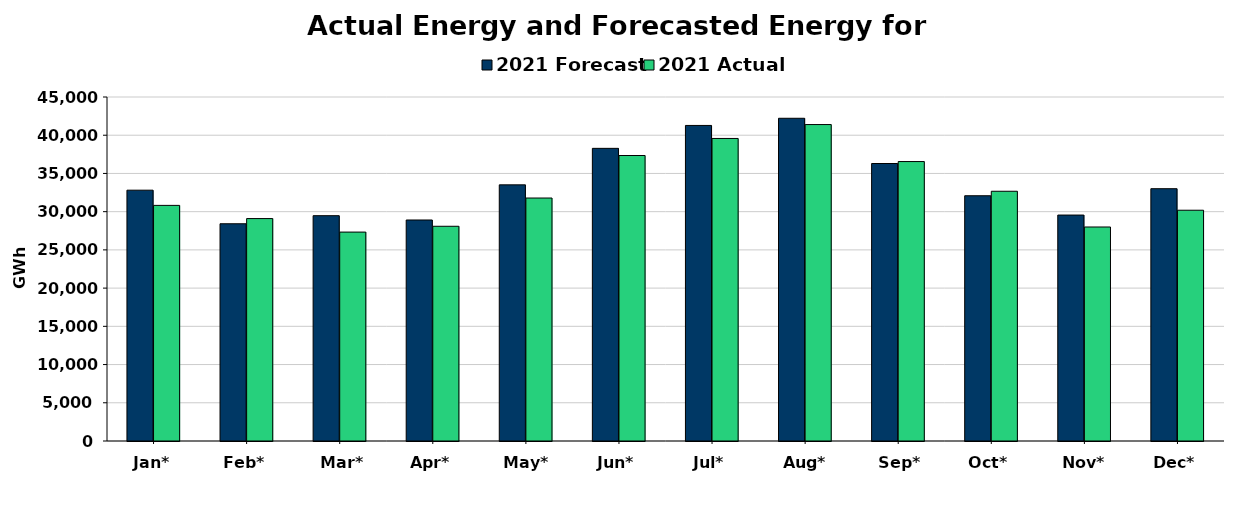
| Category | 2021 Forecast | 2021 Actual |
|---|---|---|
| Jan* | 32810 | 30822 |
| Feb* | 28418 | 29096 |
| Mar* | 29475 | 27328 |
| Apr* | 28911 | 28090 |
| May* | 33507 | 31785 |
| Jun* | 38283 | 37346 |
| Jul* | 41278 | 39577 |
| Aug* | 42217 | 41396 |
| Sep* | 36300 | 36555 |
| Oct* | 32084 | 32670 |
| Nov* | 29556 | 27996 |
| Dec* | 33004 | 30188 |